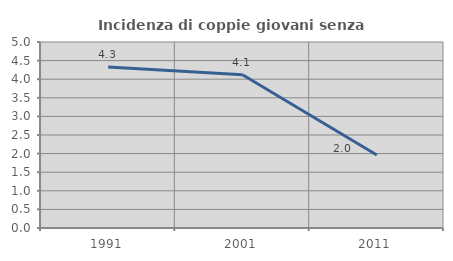
| Category | Incidenza di coppie giovani senza figli |
|---|---|
| 1991.0 | 4.327 |
| 2001.0 | 4.118 |
| 2011.0 | 1.961 |